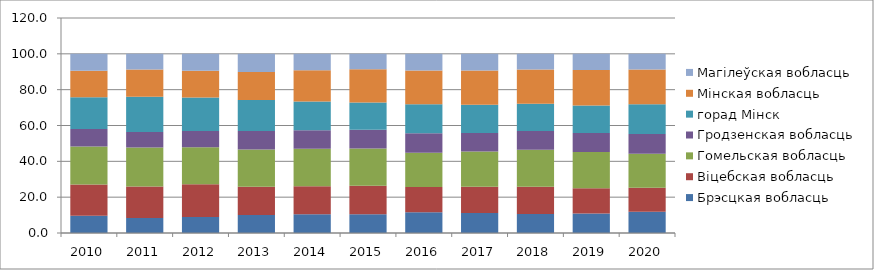
| Category | Брэсцкая вобласць | Віцебская вобласць | Гомельская вобласць | Гродзенская вобласць | горад Мінск | Мінская вобласць | Магілеўская вобласць |
|---|---|---|---|---|---|---|---|
| 0 | 9.6 | 17.5 | 21.2 | 9.7 | 17.8 | 14.7 | 9.5 |
| 1 | 8.4 | 17.5 | 21.8 | 8.7 | 19.6 | 15.2 | 8.8 |
| 2 | 9 | 18.2 | 20.6 | 9.2 | 18.6 | 14.9 | 9.5 |
| 3 | 10 | 15.8 | 20.8 | 10.3 | 17.3 | 15.7 | 10.1 |
| 4 | 10.4 | 15.7 | 20.9 | 10.4 | 16 | 17.5 | 9.1 |
| 5 | 10.5 | 15.9 | 20.8 | 10.4 | 15.3 | 18.5 | 8.6 |
| 6 | 11.6 | 14.1 | 19.1 | 10.9 | 16.1 | 18.9 | 9.3 |
| 7 | 11.2 | 14.6 | 19.7 | 10.3 | 15.8 | 19.1 | 9.3 |
| 8 | 10.6 | 15.2 | 20.6 | 10.5 | 15.3 | 19.1 | 8.7 |
| 9 | 10.9 | 14.1 | 20.2 | 10.6 | 15.3 | 19.9 | 9 |
| 10 | 11.9 | 13.4 | 19 | 11 | 16.5 | 19.5 | 8.7 |